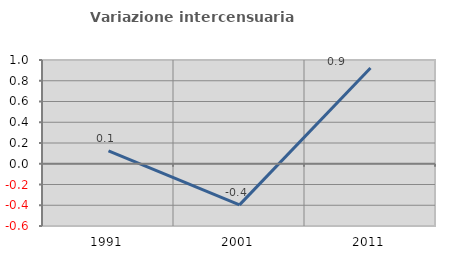
| Category | Variazione intercensuaria annua |
|---|---|
| 1991.0 | 0.123 |
| 2001.0 | -0.396 |
| 2011.0 | 0.922 |